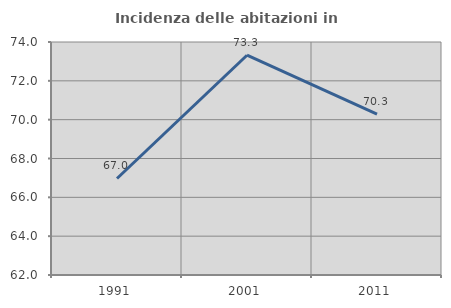
| Category | Incidenza delle abitazioni in proprietà  |
|---|---|
| 1991.0 | 66.97 |
| 2001.0 | 73.319 |
| 2011.0 | 70.29 |